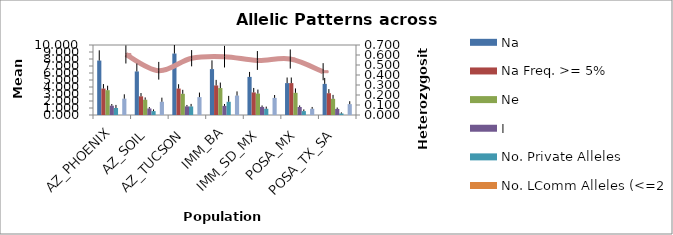
| Category | Na | Na Freq. >= 5% | Ne | I | No. Private Alleles | No. LComm Alleles (<=25%) | No. LComm Alleles (<=50%) |
|---|---|---|---|---|---|---|---|
| AZ_PHOENIX | 7.778 | 3.778 | 3.545 | 1.331 | 1 | 0 | 2.333 |
| AZ_SOIL | 6.222 | 2.667 | 2.179 | 0.932 | 0.556 | 0 | 1.889 |
| AZ_TUCSON | 8.778 | 3.778 | 3.028 | 1.231 | 1.222 | 0 | 2.556 |
| IMM_BA | 6.556 | 4.222 | 3.847 | 1.303 | 1.889 | 0 | 2.778 |
| IMM_SD_MX | 5.444 | 3.222 | 3.061 | 1.152 | 0.889 | 0 | 2.444 |
| POSA_MX | 4.556 | 4.556 | 3.168 | 1.148 | 0.556 | 0 | 0.889 |
| POSA_TX_SA | 4.444 | 3.111 | 2.317 | 0.87 | 0.222 | 0 | 1.556 |